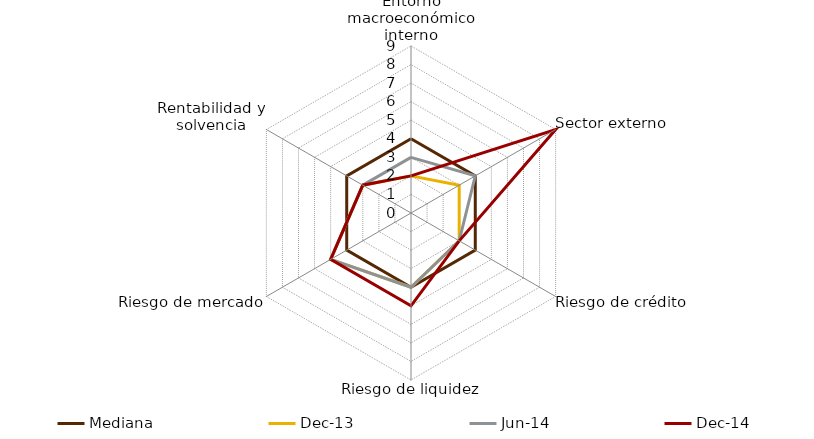
| Category | Mediana | dic-13 | jun-14 | dic-14 |
|---|---|---|---|---|
| Entorno macroeconómico interno | 4 | 2 | 3 | 2 |
| Sector externo | 4 | 3 | 4 | 9 |
| Riesgo de crédito | 4 | 3 | 3 | 3 |
| Riesgo de liquidez | 4 | 4 | 4 | 5 |
| Riesgo de mercado | 4 | 5 | 5 | 5 |
| Rentabilidad y solvencia | 4 | 3 | 3 | 3 |